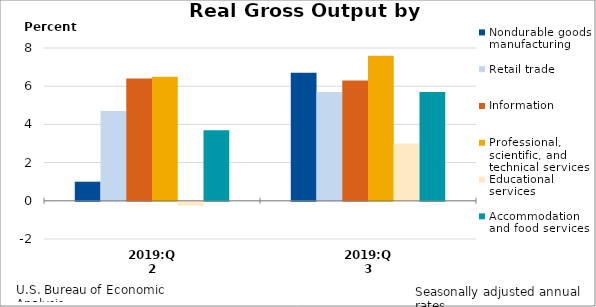
| Category | Nondurable goods manufacturing | Retail trade | Information | Professional, scientific, and technical services | Educational services | Accommodation and food services |
|---|---|---|---|---|---|---|
| 2019:Q2 | 1 | 4.7 | 6.4 | 6.5 | -0.2 | 3.7 |
| 2019:Q3 | 6.7 | 5.7 | 6.3 | 7.6 | 3 | 5.7 |